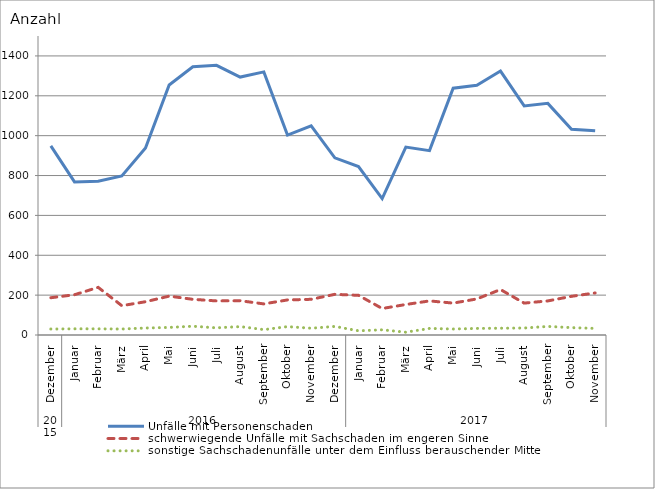
| Category | Unfälle mit Personenschaden | schwerwiegende Unfälle mit Sachschaden im engeren Sinne | sonstige Sachschadenunfälle unter dem Einfluss berauschender Mittel |
|---|---|---|---|
| 0 | 949 | 187 | 30 |
| 1 | 768 | 202 | 31 |
| 2 | 771 | 239 | 31 |
| 3 | 798 | 147 | 30 |
| 4 | 938 | 167 | 35 |
| 5 | 1254 | 195 | 38 |
| 6 | 1346 | 179 | 44 |
| 7 | 1353 | 171 | 36 |
| 8 | 1294 | 172 | 42 |
| 9 | 1320 | 156 | 27 |
| 10 | 1003 | 176 | 42 |
| 11 | 1049 | 179 | 34 |
| 12 | 889 | 204 | 43 |
| 13 | 845 | 199 | 21 |
| 14 | 684 | 133 | 26 |
| 15 | 943 | 153 | 14 |
| 16 | 925 | 171 | 33 |
| 17 | 1238 | 160 | 30 |
| 18 | 1253 | 181 | 33 |
| 19 | 1324 | 228 | 34 |
| 20 | 1149 | 160 | 35 |
| 21 | 1162 | 171 | 43 |
| 22 | 1032 | 194 | 37 |
| 23 | 1025 | 211 | 33 |